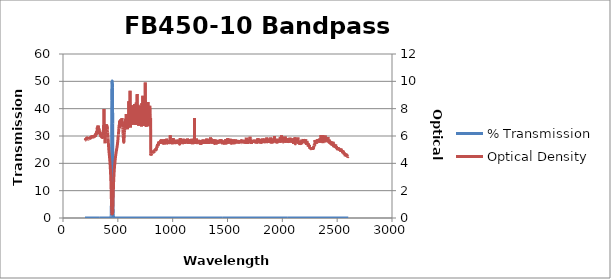
| Category | % Transmission |
|---|---|
| 2600.0 | 0.003 |
| 2599.0 | 0.003 |
| 2598.0 | 0.003 |
| 2597.0 | 0.003 |
| 2596.0 | 0.003 |
| 2595.0 | 0.003 |
| 2594.0 | 0.003 |
| 2593.0 | 0.003 |
| 2592.0 | 0.003 |
| 2591.0 | 0.003 |
| 2590.0 | 0.003 |
| 2589.0 | 0.003 |
| 2588.0 | 0.003 |
| 2587.0 | 0.003 |
| 2586.0 | 0.003 |
| 2585.0 | 0.003 |
| 2584.0 | 0.003 |
| 2583.0 | 0.002 |
| 2582.0 | 0.002 |
| 2581.0 | 0.002 |
| 2580.0 | 0.003 |
| 2579.0 | 0.002 |
| 2578.0 | 0.003 |
| 2577.0 | 0.002 |
| 2576.0 | 0.002 |
| 2575.0 | 0.002 |
| 2574.0 | 0.003 |
| 2573.0 | 0.002 |
| 2572.0 | 0.002 |
| 2571.0 | 0.002 |
| 2570.0 | 0.002 |
| 2569.0 | 0.002 |
| 2568.0 | 0.002 |
| 2567.0 | 0.002 |
| 2566.0 | 0.002 |
| 2565.0 | 0.002 |
| 2564.0 | 0.002 |
| 2563.0 | 0.002 |
| 2562.0 | 0.002 |
| 2561.0 | 0.002 |
| 2560.0 | 0.002 |
| 2559.0 | 0.002 |
| 2558.0 | 0.002 |
| 2557.0 | 0.002 |
| 2556.0 | 0.002 |
| 2555.0 | 0.001 |
| 2554.0 | 0.002 |
| 2553.0 | 0.002 |
| 2552.0 | 0.001 |
| 2551.0 | 0.002 |
| 2550.0 | 0.001 |
| 2549.0 | 0.001 |
| 2548.0 | 0.001 |
| 2547.0 | 0.001 |
| 2546.0 | 0.001 |
| 2545.0 | 0.001 |
| 2544.0 | 0.001 |
| 2543.0 | 0.001 |
| 2542.0 | 0.001 |
| 2541.0 | 0.001 |
| 2540.0 | 0.001 |
| 2539.0 | 0.001 |
| 2538.0 | 0.001 |
| 2537.0 | 0.001 |
| 2536.0 | 0.001 |
| 2535.0 | 0.001 |
| 2534.0 | 0.001 |
| 2533.0 | 0.001 |
| 2532.0 | 0.001 |
| 2531.0 | 0.001 |
| 2530.0 | 0.001 |
| 2529.0 | 0.001 |
| 2528.0 | 0.001 |
| 2527.0 | 0.001 |
| 2526.0 | 0.001 |
| 2525.0 | 0.001 |
| 2524.0 | 0.001 |
| 2523.0 | 0.001 |
| 2522.0 | 0.001 |
| 2521.0 | 0.001 |
| 2520.0 | 0.001 |
| 2519.0 | 0.001 |
| 2518.0 | 0.001 |
| 2517.0 | 0.001 |
| 2516.0 | 0.001 |
| 2515.0 | 0.001 |
| 2514.0 | 0.001 |
| 2513.0 | 0.001 |
| 2512.0 | 0.001 |
| 2511.0 | 0.001 |
| 2510.0 | 0.001 |
| 2509.0 | 0.001 |
| 2508.0 | 0.001 |
| 2507.0 | 0.001 |
| 2506.0 | 0.001 |
| 2505.0 | 0.001 |
| 2504.0 | 0.001 |
| 2503.0 | 0.001 |
| 2502.0 | 0.001 |
| 2501.0 | 0.001 |
| 2500.0 | 0.001 |
| 2499.0 | 0.001 |
| 2498.0 | 0.001 |
| 2497.0 | 0.001 |
| 2496.0 | 0.001 |
| 2495.0 | 0.001 |
| 2494.0 | 0.001 |
| 2493.0 | 0.001 |
| 2492.0 | 0.001 |
| 2491.0 | 0.001 |
| 2490.0 | 0.001 |
| 2489.0 | 0.001 |
| 2488.0 | 0.001 |
| 2487.0 | 0.001 |
| 2486.0 | 0 |
| 2485.0 | 0.001 |
| 2484.0 | 0.001 |
| 2483.0 | 0.001 |
| 2482.0 | 0.001 |
| 2481.0 | 0 |
| 2480.0 | 0 |
| 2479.0 | 0.001 |
| 2478.0 | 0.001 |
| 2477.0 | 0 |
| 2476.0 | 0 |
| 2475.0 | 0 |
| 2474.0 | 0.001 |
| 2473.0 | 0.001 |
| 2472.0 | 0 |
| 2471.0 | 0 |
| 2470.0 | 0.001 |
| 2469.0 | 0.001 |
| 2468.0 | 0 |
| 2467.0 | 0 |
| 2466.0 | 0.001 |
| 2465.0 | 0 |
| 2464.0 | 0 |
| 2463.0 | 0 |
| 2462.0 | 0 |
| 2461.0 | 0 |
| 2460.0 | 0 |
| 2459.0 | 0 |
| 2458.0 | 0 |
| 2457.0 | 0 |
| 2456.0 | 0 |
| 2455.0 | 0 |
| 2454.0 | 0.001 |
| 2453.0 | 0 |
| 2452.0 | 0 |
| 2451.0 | 0 |
| 2450.0 | 0 |
| 2449.0 | 0 |
| 2448.0 | 0 |
| 2447.0 | 0 |
| 2446.0 | 0 |
| 2445.0 | 0 |
| 2444.0 | 0 |
| 2443.0 | 0 |
| 2442.0 | 0 |
| 2441.0 | 0 |
| 2440.0 | 0 |
| 2439.0 | 0 |
| 2438.0 | 0 |
| 2437.0 | 0 |
| 2436.0 | 0 |
| 2435.0 | 0 |
| 2434.0 | 0 |
| 2433.0 | 0 |
| 2432.0 | 0 |
| 2431.0 | 0 |
| 2430.0 | 0 |
| 2429.0 | 0 |
| 2428.0 | 0 |
| 2427.0 | 0 |
| 2426.0 | 0 |
| 2425.0 | 0 |
| 2424.0 | 0 |
| 2423.0 | 0 |
| 2422.0 | 0 |
| 2421.0 | 0 |
| 2420.0 | 0 |
| 2419.0 | 0 |
| 2418.0 | 0 |
| 2417.0 | 0 |
| 2416.0 | 0 |
| 2415.0 | 0 |
| 2414.0 | 0 |
| 2413.0 | 0 |
| 2412.0 | 0 |
| 2411.0 | 0 |
| 2410.0 | 0 |
| 2409.0 | 0 |
| 2408.0 | 0 |
| 2407.0 | 0 |
| 2406.0 | 0 |
| 2405.0 | 0 |
| 2404.0 | 0 |
| 2403.0 | 0 |
| 2402.0 | 0 |
| 2401.0 | 0 |
| 2400.0 | 0 |
| 2399.0 | 0 |
| 2398.0 | 0 |
| 2397.0 | 0 |
| 2396.0 | 0 |
| 2395.0 | 0 |
| 2394.0 | 0 |
| 2393.0 | 0 |
| 2392.0 | 0 |
| 2391.0 | 0 |
| 2390.0 | 0 |
| 2389.0 | 0 |
| 2388.0 | 0 |
| 2387.0 | 0 |
| 2386.0 | 0 |
| 2385.0 | 0 |
| 2384.0 | 0 |
| 2383.0 | 0 |
| 2382.0 | 0 |
| 2381.0 | 0 |
| 2380.0 | 0 |
| 2379.0 | 0 |
| 2378.0 | 0 |
| 2377.0 | 0 |
| 2376.0 | 0 |
| 2375.0 | 0 |
| 2374.0 | 0 |
| 2373.0 | 0 |
| 2372.0 | 0 |
| 2371.0 | 0 |
| 2370.0 | 0 |
| 2369.0 | 0 |
| 2368.0 | 0 |
| 2367.0 | 0 |
| 2366.0 | 0 |
| 2365.0 | 0 |
| 2364.0 | 0 |
| 2363.0 | 0 |
| 2362.0 | 0 |
| 2361.0 | 0 |
| 2360.0 | 0 |
| 2359.0 | 0 |
| 2358.0 | 0 |
| 2357.0 | 0 |
| 2356.0 | 0 |
| 2355.0 | 0 |
| 2354.0 | 0 |
| 2353.0 | 0 |
| 2352.0 | 0 |
| 2351.0 | 0 |
| 2350.0 | 0 |
| 2349.0 | 0 |
| 2348.0 | 0 |
| 2347.0 | 0 |
| 2346.0 | 0 |
| 2345.0 | 0 |
| 2344.0 | 0 |
| 2343.0 | 0 |
| 2342.0 | 0 |
| 2341.0 | 0 |
| 2340.0 | 0 |
| 2339.0 | 0 |
| 2338.0 | 0 |
| 2337.0 | 0 |
| 2336.0 | 0 |
| 2335.0 | 0 |
| 2334.0 | 0 |
| 2333.0 | 0 |
| 2332.0 | 0 |
| 2331.0 | 0 |
| 2330.0 | 0 |
| 2329.0 | 0 |
| 2328.0 | 0 |
| 2327.0 | 0 |
| 2326.0 | 0 |
| 2325.0 | 0 |
| 2324.0 | 0 |
| 2323.0 | 0 |
| 2322.0 | 0 |
| 2321.0 | 0 |
| 2320.0 | 0 |
| 2319.0 | 0 |
| 2318.0 | 0 |
| 2317.0 | 0 |
| 2316.0 | 0 |
| 2315.0 | 0 |
| 2314.0 | 0 |
| 2313.0 | 0 |
| 2312.0 | 0 |
| 2311.0 | 0 |
| 2310.0 | 0 |
| 2309.0 | 0 |
| 2308.0 | 0 |
| 2307.0 | 0 |
| 2306.0 | 0 |
| 2305.0 | 0 |
| 2304.0 | 0 |
| 2303.0 | 0 |
| 2302.0 | 0 |
| 2301.0 | 0 |
| 2300.0 | 0 |
| 2299.0 | 0 |
| 2298.0 | 0 |
| 2297.0 | 0 |
| 2296.0 | 0 |
| 2295.0 | 0 |
| 2294.0 | 0 |
| 2293.0 | 0 |
| 2292.0 | 0 |
| 2291.0 | 0 |
| 2290.0 | 0 |
| 2289.0 | 0.001 |
| 2288.0 | 0.001 |
| 2287.0 | 0.001 |
| 2286.0 | 0.001 |
| 2285.0 | 0.001 |
| 2284.0 | 0.001 |
| 2283.0 | 0.001 |
| 2282.0 | 0.001 |
| 2281.0 | 0.001 |
| 2280.0 | 0.001 |
| 2279.0 | 0.001 |
| 2278.0 | 0.001 |
| 2277.0 | 0.001 |
| 2276.0 | 0.001 |
| 2275.0 | 0.001 |
| 2274.0 | 0.001 |
| 2273.0 | 0.001 |
| 2272.0 | 0.001 |
| 2271.0 | 0.001 |
| 2270.0 | 0.001 |
| 2269.0 | 0.001 |
| 2268.0 | 0.001 |
| 2267.0 | 0.001 |
| 2266.0 | 0.001 |
| 2265.0 | 0.001 |
| 2264.0 | 0.001 |
| 2263.0 | 0.001 |
| 2262.0 | 0.001 |
| 2261.0 | 0.001 |
| 2260.0 | 0.001 |
| 2259.0 | 0.001 |
| 2258.0 | 0.001 |
| 2257.0 | 0.001 |
| 2256.0 | 0.001 |
| 2255.0 | 0.001 |
| 2254.0 | 0.001 |
| 2253.0 | 0.001 |
| 2252.0 | 0.001 |
| 2251.0 | 0.001 |
| 2250.0 | 0.001 |
| 2249.0 | 0.001 |
| 2248.0 | 0.001 |
| 2247.0 | 0.001 |
| 2246.0 | 0 |
| 2245.0 | 0.001 |
| 2244.0 | 0.001 |
| 2243.0 | 0 |
| 2242.0 | 0.001 |
| 2241.0 | 0 |
| 2240.0 | 0.001 |
| 2239.0 | 0 |
| 2238.0 | 0.001 |
| 2237.0 | 0 |
| 2236.0 | 0 |
| 2235.0 | 0 |
| 2234.0 | 0 |
| 2233.0 | 0 |
| 2232.0 | 0 |
| 2231.0 | 0 |
| 2230.0 | 0 |
| 2229.0 | 0 |
| 2228.0 | 0 |
| 2227.0 | 0 |
| 2226.0 | 0 |
| 2225.0 | 0 |
| 2224.0 | 0 |
| 2223.0 | 0 |
| 2222.0 | 0 |
| 2221.0 | 0 |
| 2220.0 | 0 |
| 2219.0 | 0 |
| 2218.0 | 0 |
| 2217.0 | 0 |
| 2216.0 | 0 |
| 2215.0 | 0 |
| 2214.0 | 0 |
| 2213.0 | 0 |
| 2212.0 | 0 |
| 2211.0 | 0 |
| 2210.0 | 0 |
| 2209.0 | 0 |
| 2208.0 | 0 |
| 2207.0 | 0 |
| 2206.0 | 0 |
| 2205.0 | 0 |
| 2204.0 | 0 |
| 2203.0 | 0 |
| 2202.0 | 0 |
| 2201.0 | 0 |
| 2200.0 | 0 |
| 2199.0 | 0 |
| 2198.0 | 0 |
| 2197.0 | 0 |
| 2196.0 | 0 |
| 2195.0 | 0 |
| 2194.0 | 0 |
| 2193.0 | 0 |
| 2192.0 | 0 |
| 2191.0 | 0 |
| 2190.0 | 0 |
| 2189.0 | 0 |
| 2188.0 | 0 |
| 2187.0 | 0 |
| 2186.0 | 0 |
| 2185.0 | 0 |
| 2184.0 | 0 |
| 2183.0 | 0 |
| 2182.0 | 0 |
| 2181.0 | 0 |
| 2180.0 | 0 |
| 2179.0 | 0 |
| 2178.0 | 0 |
| 2177.0 | 0 |
| 2176.0 | 0 |
| 2175.0 | 0 |
| 2174.0 | 0 |
| 2173.0 | 0 |
| 2172.0 | 0 |
| 2171.0 | 0 |
| 2170.0 | 0 |
| 2169.0 | 0 |
| 2168.0 | 0 |
| 2167.0 | 0 |
| 2166.0 | 0 |
| 2165.0 | 0 |
| 2164.0 | 0 |
| 2163.0 | 0 |
| 2162.0 | 0 |
| 2161.0 | 0 |
| 2160.0 | 0 |
| 2159.0 | 0 |
| 2158.0 | 0 |
| 2157.0 | 0 |
| 2156.0 | 0 |
| 2155.0 | 0 |
| 2154.0 | 0 |
| 2153.0 | 0 |
| 2152.0 | 0 |
| 2151.0 | 0 |
| 2150.0 | 0 |
| 2149.0 | 0 |
| 2148.0 | 0 |
| 2147.0 | 0 |
| 2146.0 | 0 |
| 2145.0 | 0 |
| 2144.0 | 0 |
| 2143.0 | 0 |
| 2142.0 | 0 |
| 2141.0 | 0 |
| 2140.0 | 0 |
| 2139.0 | 0 |
| 2138.0 | 0 |
| 2137.0 | 0 |
| 2136.0 | 0 |
| 2135.0 | 0 |
| 2134.0 | 0 |
| 2133.0 | 0 |
| 2132.0 | 0 |
| 2131.0 | 0 |
| 2130.0 | 0 |
| 2129.0 | 0 |
| 2128.0 | 0 |
| 2127.0 | 0 |
| 2126.0 | 0 |
| 2125.0 | 0 |
| 2124.0 | 0 |
| 2123.0 | 0 |
| 2122.0 | 0 |
| 2121.0 | 0 |
| 2120.0 | 0 |
| 2119.0 | 0 |
| 2118.0 | 0 |
| 2117.0 | 0 |
| 2116.0 | 0 |
| 2115.0 | 0 |
| 2114.0 | 0 |
| 2113.0 | 0 |
| 2112.0 | 0 |
| 2111.0 | 0 |
| 2110.0 | 0 |
| 2109.0 | 0 |
| 2108.0 | 0 |
| 2107.0 | 0 |
| 2106.0 | 0 |
| 2105.0 | 0 |
| 2104.0 | 0 |
| 2103.0 | 0 |
| 2102.0 | 0 |
| 2101.0 | 0 |
| 2100.0 | 0 |
| 2099.0 | 0 |
| 2098.0 | 0 |
| 2097.0 | 0 |
| 2096.0 | 0 |
| 2095.0 | 0 |
| 2094.0 | 0 |
| 2093.0 | 0 |
| 2092.0 | 0 |
| 2091.0 | 0 |
| 2090.0 | 0 |
| 2089.0 | 0 |
| 2088.0 | 0 |
| 2087.0 | 0 |
| 2086.0 | 0 |
| 2085.0 | 0 |
| 2084.0 | 0 |
| 2083.0 | 0 |
| 2082.0 | 0 |
| 2081.0 | 0 |
| 2080.0 | 0 |
| 2079.0 | 0 |
| 2078.0 | 0 |
| 2077.0 | 0 |
| 2076.0 | 0 |
| 2075.0 | 0 |
| 2074.0 | 0 |
| 2073.0 | 0 |
| 2072.0 | 0 |
| 2071.0 | 0 |
| 2070.0 | 0 |
| 2069.0 | 0 |
| 2068.0 | 0 |
| 2067.0 | 0 |
| 2066.0 | 0 |
| 2065.0 | 0 |
| 2064.0 | 0 |
| 2063.0 | 0 |
| 2062.0 | 0 |
| 2061.0 | 0 |
| 2060.0 | 0 |
| 2059.0 | 0 |
| 2058.0 | 0 |
| 2057.0 | 0 |
| 2056.0 | 0 |
| 2055.0 | 0 |
| 2054.0 | 0 |
| 2053.0 | 0 |
| 2052.0 | 0 |
| 2051.0 | 0 |
| 2050.0 | 0 |
| 2049.0 | 0 |
| 2048.0 | 0 |
| 2047.0 | 0 |
| 2046.0 | 0 |
| 2045.0 | 0 |
| 2044.0 | 0 |
| 2043.0 | 0 |
| 2042.0 | 0 |
| 2041.0 | 0 |
| 2040.0 | 0 |
| 2039.0 | 0 |
| 2038.0 | 0 |
| 2037.0 | 0 |
| 2036.0 | 0 |
| 2035.0 | 0 |
| 2034.0 | 0 |
| 2033.0 | 0 |
| 2032.0 | 0 |
| 2031.0 | 0 |
| 2030.0 | 0 |
| 2029.0 | 0 |
| 2028.0 | 0 |
| 2027.0 | 0 |
| 2026.0 | 0 |
| 2025.0 | 0 |
| 2024.0 | 0 |
| 2023.0 | 0 |
| 2022.0 | 0 |
| 2021.0 | 0 |
| 2020.0 | 0 |
| 2019.0 | 0 |
| 2018.0 | 0 |
| 2017.0 | 0 |
| 2016.0 | 0 |
| 2015.0 | 0 |
| 2014.0 | 0 |
| 2013.0 | 0 |
| 2012.0 | 0 |
| 2011.0 | 0 |
| 2010.0 | 0 |
| 2009.0 | 0 |
| 2008.0 | 0 |
| 2007.0 | 0 |
| 2006.0 | 0 |
| 2005.0 | 0 |
| 2004.0 | 0 |
| 2003.0 | 0 |
| 2002.0 | 0 |
| 2001.0 | 0 |
| 2000.0 | 0 |
| 1999.0 | 0 |
| 1998.0 | 0 |
| 1997.0 | 0 |
| 1996.0 | 0 |
| 1995.0 | 0 |
| 1994.0 | 0 |
| 1993.0 | 0 |
| 1992.0 | 0 |
| 1991.0 | 0 |
| 1990.0 | 0 |
| 1989.0 | 0 |
| 1988.0 | 0 |
| 1987.0 | 0 |
| 1986.0 | 0 |
| 1985.0 | 0 |
| 1984.0 | 0 |
| 1983.0 | 0 |
| 1982.0 | 0 |
| 1981.0 | 0 |
| 1980.0 | 0 |
| 1979.0 | 0 |
| 1978.0 | 0 |
| 1977.0 | 0 |
| 1976.0 | 0 |
| 1975.0 | 0 |
| 1974.0 | 0 |
| 1973.0 | 0 |
| 1972.0 | 0 |
| 1971.0 | 0 |
| 1970.0 | 0 |
| 1969.0 | 0 |
| 1968.0 | 0 |
| 1967.0 | 0 |
| 1966.0 | 0 |
| 1965.0 | 0 |
| 1964.0 | 0 |
| 1963.0 | 0 |
| 1962.0 | 0 |
| 1961.0 | 0 |
| 1960.0 | 0 |
| 1959.0 | 0 |
| 1958.0 | 0 |
| 1957.0 | 0 |
| 1956.0 | 0 |
| 1955.0 | 0 |
| 1954.0 | 0 |
| 1953.0 | 0 |
| 1952.0 | 0 |
| 1951.0 | 0 |
| 1950.0 | 0 |
| 1949.0 | 0 |
| 1948.0 | 0 |
| 1947.0 | 0 |
| 1946.0 | 0 |
| 1945.0 | 0 |
| 1944.0 | 0 |
| 1943.0 | 0 |
| 1942.0 | 0 |
| 1941.0 | 0 |
| 1940.0 | 0 |
| 1939.0 | 0 |
| 1938.0 | 0 |
| 1937.0 | 0 |
| 1936.0 | 0 |
| 1935.0 | 0 |
| 1934.0 | 0 |
| 1933.0 | 0 |
| 1932.0 | 0 |
| 1931.0 | 0 |
| 1930.0 | 0 |
| 1929.0 | 0 |
| 1928.0 | 0 |
| 1927.0 | 0 |
| 1926.0 | 0 |
| 1925.0 | 0 |
| 1924.0 | 0 |
| 1923.0 | 0 |
| 1922.0 | 0 |
| 1921.0 | 0 |
| 1920.0 | 0 |
| 1919.0 | 0 |
| 1918.0 | 0 |
| 1917.0 | 0 |
| 1916.0 | 0 |
| 1915.0 | 0 |
| 1914.0 | 0 |
| 1913.0 | 0 |
| 1912.0 | 0 |
| 1911.0 | 0 |
| 1910.0 | 0 |
| 1909.0 | 0 |
| 1908.0 | 0 |
| 1907.0 | 0 |
| 1906.0 | 0 |
| 1905.0 | 0 |
| 1904.0 | 0 |
| 1903.0 | 0 |
| 1902.0 | 0 |
| 1901.0 | 0 |
| 1900.0 | 0 |
| 1899.0 | 0 |
| 1898.0 | 0 |
| 1897.0 | 0 |
| 1896.0 | 0 |
| 1895.0 | 0 |
| 1894.0 | 0 |
| 1893.0 | 0 |
| 1892.0 | 0 |
| 1891.0 | 0 |
| 1890.0 | 0 |
| 1889.0 | 0 |
| 1888.0 | 0 |
| 1887.0 | 0 |
| 1886.0 | 0 |
| 1885.0 | 0 |
| 1884.0 | 0 |
| 1883.0 | 0 |
| 1882.0 | 0 |
| 1881.0 | 0 |
| 1880.0 | 0 |
| 1879.0 | 0 |
| 1878.0 | 0 |
| 1877.0 | 0 |
| 1876.0 | 0 |
| 1875.0 | 0 |
| 1874.0 | 0 |
| 1873.0 | 0 |
| 1872.0 | 0 |
| 1871.0 | 0 |
| 1870.0 | 0 |
| 1869.0 | 0 |
| 1868.0 | 0 |
| 1867.0 | 0 |
| 1866.0 | 0 |
| 1865.0 | 0 |
| 1864.0 | 0 |
| 1863.0 | 0 |
| 1862.0 | 0 |
| 1861.0 | 0 |
| 1860.0 | 0 |
| 1859.0 | 0 |
| 1858.0 | 0 |
| 1857.0 | 0 |
| 1856.0 | 0 |
| 1855.0 | 0 |
| 1854.0 | 0 |
| 1853.0 | 0 |
| 1852.0 | 0 |
| 1851.0 | 0 |
| 1850.0 | 0 |
| 1849.0 | 0 |
| 1848.0 | 0 |
| 1847.0 | 0 |
| 1846.0 | 0 |
| 1845.0 | 0 |
| 1844.0 | 0 |
| 1843.0 | 0 |
| 1842.0 | 0 |
| 1841.0 | 0 |
| 1840.0 | 0 |
| 1839.0 | 0 |
| 1838.0 | 0 |
| 1837.0 | 0 |
| 1836.0 | 0 |
| 1835.0 | 0 |
| 1834.0 | 0 |
| 1833.0 | 0 |
| 1832.0 | 0 |
| 1831.0 | 0 |
| 1830.0 | 0 |
| 1829.0 | 0 |
| 1828.0 | 0 |
| 1827.0 | 0 |
| 1826.0 | 0 |
| 1825.0 | 0 |
| 1824.0 | 0 |
| 1823.0 | 0 |
| 1822.0 | 0 |
| 1821.0 | 0 |
| 1820.0 | 0 |
| 1819.0 | 0 |
| 1818.0 | 0 |
| 1817.0 | 0 |
| 1816.0 | 0 |
| 1815.0 | 0 |
| 1814.0 | 0 |
| 1813.0 | 0 |
| 1812.0 | 0 |
| 1811.0 | 0 |
| 1810.0 | 0 |
| 1809.0 | 0 |
| 1808.0 | 0 |
| 1807.0 | 0 |
| 1806.0 | 0 |
| 1805.0 | 0 |
| 1804.0 | 0 |
| 1803.0 | 0 |
| 1802.0 | 0 |
| 1801.0 | 0 |
| 1800.0 | 0 |
| 1799.0 | 0 |
| 1798.0 | 0 |
| 1797.0 | 0 |
| 1796.0 | 0 |
| 1795.0 | 0 |
| 1794.0 | 0 |
| 1793.0 | 0 |
| 1792.0 | 0 |
| 1791.0 | 0 |
| 1790.0 | 0 |
| 1789.0 | 0 |
| 1788.0 | 0 |
| 1787.0 | 0 |
| 1786.0 | 0 |
| 1785.0 | 0 |
| 1784.0 | 0 |
| 1783.0 | 0 |
| 1782.0 | 0 |
| 1781.0 | 0 |
| 1780.0 | 0 |
| 1779.0 | 0 |
| 1778.0 | 0 |
| 1777.0 | 0 |
| 1776.0 | 0 |
| 1775.0 | 0 |
| 1774.0 | 0 |
| 1773.0 | 0 |
| 1772.0 | 0 |
| 1771.0 | 0 |
| 1770.0 | 0 |
| 1769.0 | 0 |
| 1768.0 | 0 |
| 1767.0 | 0 |
| 1766.0 | 0 |
| 1765.0 | 0 |
| 1764.0 | 0 |
| 1763.0 | 0 |
| 1762.0 | 0 |
| 1761.0 | 0 |
| 1760.0 | 0 |
| 1759.0 | 0 |
| 1758.0 | 0 |
| 1757.0 | 0 |
| 1756.0 | 0 |
| 1755.0 | 0 |
| 1754.0 | 0 |
| 1753.0 | 0 |
| 1752.0 | 0 |
| 1751.0 | 0 |
| 1750.0 | 0 |
| 1749.0 | 0 |
| 1748.0 | 0 |
| 1747.0 | 0 |
| 1746.0 | 0 |
| 1745.0 | 0 |
| 1744.0 | 0 |
| 1743.0 | 0 |
| 1742.0 | 0 |
| 1741.0 | 0 |
| 1740.0 | 0 |
| 1739.0 | 0 |
| 1738.0 | 0 |
| 1737.0 | 0 |
| 1736.0 | 0 |
| 1735.0 | 0 |
| 1734.0 | 0 |
| 1733.0 | 0 |
| 1732.0 | 0 |
| 1731.0 | 0 |
| 1730.0 | 0 |
| 1729.0 | 0 |
| 1728.0 | 0 |
| 1727.0 | 0 |
| 1726.0 | 0 |
| 1725.0 | 0 |
| 1724.0 | 0 |
| 1723.0 | 0 |
| 1722.0 | 0 |
| 1721.0 | 0 |
| 1720.0 | 0 |
| 1719.0 | 0 |
| 1718.0 | 0 |
| 1717.0 | 0 |
| 1716.0 | 0 |
| 1715.0 | 0 |
| 1714.0 | 0 |
| 1713.0 | 0 |
| 1712.0 | 0 |
| 1711.0 | 0 |
| 1710.0 | 0 |
| 1709.0 | 0 |
| 1708.0 | 0 |
| 1707.0 | 0 |
| 1706.0 | 0 |
| 1705.0 | 0 |
| 1704.0 | 0 |
| 1703.0 | 0 |
| 1702.0 | 0 |
| 1701.0 | 0 |
| 1700.0 | 0 |
| 1699.0 | 0 |
| 1698.0 | 0 |
| 1697.0 | 0 |
| 1696.0 | 0 |
| 1695.0 | 0 |
| 1694.0 | 0 |
| 1693.0 | 0 |
| 1692.0 | 0 |
| 1691.0 | 0 |
| 1690.0 | 0 |
| 1689.0 | 0 |
| 1688.0 | 0 |
| 1687.0 | 0 |
| 1686.0 | 0 |
| 1685.0 | 0 |
| 1684.0 | 0 |
| 1683.0 | 0 |
| 1682.0 | 0 |
| 1681.0 | 0 |
| 1680.0 | 0 |
| 1679.0 | 0 |
| 1678.0 | 0 |
| 1677.0 | 0 |
| 1676.0 | 0 |
| 1675.0 | 0 |
| 1674.0 | 0 |
| 1673.0 | 0 |
| 1672.0 | 0 |
| 1671.0 | 0 |
| 1670.0 | 0 |
| 1669.0 | 0 |
| 1668.0 | 0 |
| 1667.0 | 0 |
| 1666.0 | 0 |
| 1665.0 | 0 |
| 1664.0 | 0 |
| 1663.0 | 0 |
| 1662.0 | 0 |
| 1661.0 | 0 |
| 1660.0 | 0 |
| 1659.0 | 0 |
| 1658.0 | 0 |
| 1657.0 | 0 |
| 1656.0 | 0 |
| 1655.0 | 0 |
| 1654.0 | 0 |
| 1653.0 | 0 |
| 1652.0 | 0 |
| 1651.0 | 0 |
| 1650.0 | 0 |
| 1649.0 | 0 |
| 1648.0 | 0 |
| 1647.0 | 0 |
| 1646.0 | 0 |
| 1645.0 | 0 |
| 1644.0 | 0 |
| 1643.0 | 0 |
| 1642.0 | 0 |
| 1641.0 | 0 |
| 1640.0 | 0 |
| 1639.0 | 0 |
| 1638.0 | 0 |
| 1637.0 | 0 |
| 1636.0 | 0 |
| 1635.0 | 0 |
| 1634.0 | 0 |
| 1633.0 | 0 |
| 1632.0 | 0 |
| 1631.0 | 0 |
| 1630.0 | 0 |
| 1629.0 | 0 |
| 1628.0 | 0 |
| 1627.0 | 0 |
| 1626.0 | 0 |
| 1625.0 | 0 |
| 1624.0 | 0 |
| 1623.0 | 0 |
| 1622.0 | 0 |
| 1621.0 | 0 |
| 1620.0 | 0 |
| 1619.0 | 0 |
| 1618.0 | 0 |
| 1617.0 | 0 |
| 1616.0 | 0 |
| 1615.0 | 0 |
| 1614.0 | 0 |
| 1613.0 | 0 |
| 1612.0 | 0 |
| 1611.0 | 0 |
| 1610.0 | 0 |
| 1609.0 | 0 |
| 1608.0 | 0 |
| 1607.0 | 0 |
| 1606.0 | 0 |
| 1605.0 | 0 |
| 1604.0 | 0 |
| 1603.0 | 0 |
| 1602.0 | 0 |
| 1601.0 | 0 |
| 1600.0 | 0 |
| 1599.0 | 0 |
| 1598.0 | 0 |
| 1597.0 | 0 |
| 1596.0 | 0 |
| 1595.0 | 0 |
| 1594.0 | 0 |
| 1593.0 | 0 |
| 1592.0 | 0 |
| 1591.0 | 0 |
| 1590.0 | 0 |
| 1589.0 | 0 |
| 1588.0 | 0 |
| 1587.0 | 0 |
| 1586.0 | 0 |
| 1585.0 | 0 |
| 1584.0 | 0 |
| 1583.0 | 0 |
| 1582.0 | 0 |
| 1581.0 | 0 |
| 1580.0 | 0 |
| 1579.0 | 0 |
| 1578.0 | 0 |
| 1577.0 | 0 |
| 1576.0 | 0 |
| 1575.0 | 0 |
| 1574.0 | 0 |
| 1573.0 | 0 |
| 1572.0 | 0 |
| 1571.0 | 0 |
| 1570.0 | 0 |
| 1569.0 | 0 |
| 1568.0 | 0 |
| 1567.0 | 0 |
| 1566.0 | 0 |
| 1565.0 | 0 |
| 1564.0 | 0 |
| 1563.0 | 0 |
| 1562.0 | 0 |
| 1561.0 | 0 |
| 1560.0 | 0 |
| 1559.0 | 0 |
| 1558.0 | 0 |
| 1557.0 | 0 |
| 1556.0 | 0 |
| 1555.0 | 0 |
| 1554.0 | 0 |
| 1553.0 | 0 |
| 1552.0 | 0 |
| 1551.0 | 0 |
| 1550.0 | 0 |
| 1549.0 | 0 |
| 1548.0 | 0 |
| 1547.0 | 0 |
| 1546.0 | 0 |
| 1545.0 | 0 |
| 1544.0 | 0 |
| 1543.0 | 0 |
| 1542.0 | 0 |
| 1541.0 | 0 |
| 1540.0 | 0 |
| 1539.0 | 0 |
| 1538.0 | 0 |
| 1537.0 | 0 |
| 1536.0 | 0 |
| 1535.0 | 0 |
| 1534.0 | 0 |
| 1533.0 | 0 |
| 1532.0 | 0 |
| 1531.0 | 0 |
| 1530.0 | 0 |
| 1529.0 | 0 |
| 1528.0 | 0 |
| 1527.0 | 0 |
| 1526.0 | 0 |
| 1525.0 | 0 |
| 1524.0 | 0 |
| 1523.0 | 0 |
| 1522.0 | 0 |
| 1521.0 | 0 |
| 1520.0 | 0 |
| 1519.0 | 0 |
| 1518.0 | 0 |
| 1517.0 | 0 |
| 1516.0 | 0 |
| 1515.0 | 0 |
| 1514.0 | 0 |
| 1513.0 | 0 |
| 1512.0 | 0 |
| 1511.0 | 0 |
| 1510.0 | 0 |
| 1509.0 | 0 |
| 1508.0 | 0 |
| 1507.0 | 0 |
| 1506.0 | 0 |
| 1505.0 | 0 |
| 1504.0 | 0 |
| 1503.0 | 0 |
| 1502.0 | 0 |
| 1501.0 | 0 |
| 1500.0 | 0 |
| 1499.0 | 0 |
| 1498.0 | 0 |
| 1497.0 | 0 |
| 1496.0 | 0 |
| 1495.0 | 0 |
| 1494.0 | 0 |
| 1493.0 | 0 |
| 1492.0 | 0 |
| 1491.0 | 0 |
| 1490.0 | 0 |
| 1489.0 | 0 |
| 1488.0 | 0 |
| 1487.0 | 0 |
| 1486.0 | 0 |
| 1485.0 | 0 |
| 1484.0 | 0 |
| 1483.0 | 0 |
| 1482.0 | 0 |
| 1481.0 | 0 |
| 1480.0 | 0 |
| 1479.0 | 0 |
| 1478.0 | 0 |
| 1477.0 | 0 |
| 1476.0 | 0 |
| 1475.0 | 0 |
| 1474.0 | 0 |
| 1473.0 | 0 |
| 1472.0 | 0 |
| 1471.0 | 0 |
| 1470.0 | 0 |
| 1469.0 | 0 |
| 1468.0 | 0 |
| 1467.0 | 0 |
| 1466.0 | 0 |
| 1465.0 | 0 |
| 1464.0 | 0 |
| 1463.0 | 0 |
| 1462.0 | 0 |
| 1461.0 | 0 |
| 1460.0 | 0 |
| 1459.0 | 0 |
| 1458.0 | 0 |
| 1457.0 | 0 |
| 1456.0 | 0 |
| 1455.0 | 0 |
| 1454.0 | 0 |
| 1453.0 | 0 |
| 1452.0 | 0 |
| 1451.0 | 0 |
| 1450.0 | 0 |
| 1449.0 | 0 |
| 1448.0 | 0 |
| 1447.0 | 0 |
| 1446.0 | 0 |
| 1445.0 | 0 |
| 1444.0 | 0 |
| 1443.0 | 0 |
| 1442.0 | 0 |
| 1441.0 | 0 |
| 1440.0 | 0 |
| 1439.0 | 0 |
| 1438.0 | 0 |
| 1437.0 | 0 |
| 1436.0 | 0 |
| 1435.0 | 0 |
| 1434.0 | 0 |
| 1433.0 | 0 |
| 1432.0 | 0 |
| 1431.0 | 0 |
| 1430.0 | 0 |
| 1429.0 | 0 |
| 1428.0 | 0 |
| 1427.0 | 0 |
| 1426.0 | 0 |
| 1425.0 | 0 |
| 1424.0 | 0 |
| 1423.0 | 0 |
| 1422.0 | 0 |
| 1421.0 | 0 |
| 1420.0 | 0 |
| 1419.0 | 0 |
| 1418.0 | 0 |
| 1417.0 | 0 |
| 1416.0 | 0 |
| 1415.0 | 0 |
| 1414.0 | 0 |
| 1413.0 | 0 |
| 1412.0 | 0 |
| 1411.0 | 0 |
| 1410.0 | 0 |
| 1409.0 | 0 |
| 1408.0 | 0 |
| 1407.0 | 0 |
| 1406.0 | 0 |
| 1405.0 | 0 |
| 1404.0 | 0 |
| 1403.0 | 0 |
| 1402.0 | 0 |
| 1401.0 | 0 |
| 1400.0 | 0 |
| 1399.0 | 0 |
| 1398.0 | 0 |
| 1397.0 | 0 |
| 1396.0 | 0 |
| 1395.0 | 0 |
| 1394.0 | 0 |
| 1393.0 | 0 |
| 1392.0 | 0 |
| 1391.0 | 0 |
| 1390.0 | 0 |
| 1389.0 | 0 |
| 1388.0 | 0 |
| 1387.0 | 0 |
| 1386.0 | 0 |
| 1385.0 | 0 |
| 1384.0 | 0 |
| 1383.0 | 0 |
| 1382.0 | 0 |
| 1381.0 | 0 |
| 1380.0 | 0 |
| 1379.0 | 0 |
| 1378.0 | 0 |
| 1377.0 | 0 |
| 1376.0 | 0 |
| 1375.0 | 0 |
| 1374.0 | 0 |
| 1373.0 | 0 |
| 1372.0 | 0 |
| 1371.0 | 0 |
| 1370.0 | 0 |
| 1369.0 | 0 |
| 1368.0 | 0 |
| 1367.0 | 0 |
| 1366.0 | 0 |
| 1365.0 | 0 |
| 1364.0 | 0 |
| 1363.0 | 0 |
| 1362.0 | 0 |
| 1361.0 | 0 |
| 1360.0 | 0 |
| 1359.0 | 0 |
| 1358.0 | 0 |
| 1357.0 | 0 |
| 1356.0 | 0 |
| 1355.0 | 0 |
| 1354.0 | 0 |
| 1353.0 | 0 |
| 1352.0 | 0 |
| 1351.0 | 0 |
| 1350.0 | 0 |
| 1349.0 | 0 |
| 1348.0 | 0 |
| 1347.0 | 0 |
| 1346.0 | 0 |
| 1345.0 | 0 |
| 1344.0 | 0 |
| 1343.0 | 0 |
| 1342.0 | 0 |
| 1341.0 | 0 |
| 1340.0 | 0 |
| 1339.0 | 0 |
| 1338.0 | 0 |
| 1337.0 | 0 |
| 1336.0 | 0 |
| 1335.0 | 0 |
| 1334.0 | 0 |
| 1333.0 | 0 |
| 1332.0 | 0 |
| 1331.0 | 0 |
| 1330.0 | 0 |
| 1329.0 | 0 |
| 1328.0 | 0 |
| 1327.0 | 0 |
| 1326.0 | 0 |
| 1325.0 | 0 |
| 1324.0 | 0 |
| 1323.0 | 0 |
| 1322.0 | 0 |
| 1321.0 | 0 |
| 1320.0 | 0 |
| 1319.0 | 0 |
| 1318.0 | 0 |
| 1317.0 | 0 |
| 1316.0 | 0 |
| 1315.0 | 0 |
| 1314.0 | 0 |
| 1313.0 | 0 |
| 1312.0 | 0 |
| 1311.0 | 0 |
| 1310.0 | 0 |
| 1309.0 | 0 |
| 1308.0 | 0 |
| 1307.0 | 0 |
| 1306.0 | 0 |
| 1305.0 | 0 |
| 1304.0 | 0 |
| 1303.0 | 0 |
| 1302.0 | 0 |
| 1301.0 | 0 |
| 1300.0 | 0 |
| 1299.0 | 0 |
| 1298.0 | 0 |
| 1297.0 | 0 |
| 1296.0 | 0 |
| 1295.0 | 0 |
| 1294.0 | 0 |
| 1293.0 | 0 |
| 1292.0 | 0 |
| 1291.0 | 0 |
| 1290.0 | 0 |
| 1289.0 | 0 |
| 1288.0 | 0 |
| 1287.0 | 0 |
| 1286.0 | 0 |
| 1285.0 | 0 |
| 1284.0 | 0 |
| 1283.0 | 0 |
| 1282.0 | 0 |
| 1281.0 | 0 |
| 1280.0 | 0 |
| 1279.0 | 0 |
| 1278.0 | 0 |
| 1277.0 | 0 |
| 1276.0 | 0 |
| 1275.0 | 0 |
| 1274.0 | 0 |
| 1273.0 | 0 |
| 1272.0 | 0 |
| 1271.0 | 0 |
| 1270.0 | 0 |
| 1269.0 | 0 |
| 1268.0 | 0 |
| 1267.0 | 0 |
| 1266.0 | 0 |
| 1265.0 | 0 |
| 1264.0 | 0 |
| 1263.0 | 0 |
| 1262.0 | 0 |
| 1261.0 | 0 |
| 1260.0 | 0 |
| 1259.0 | 0 |
| 1258.0 | 0 |
| 1257.0 | 0 |
| 1256.0 | 0 |
| 1255.0 | 0 |
| 1254.0 | 0 |
| 1253.0 | 0 |
| 1252.0 | 0 |
| 1251.0 | 0 |
| 1250.0 | 0 |
| 1249.0 | 0 |
| 1248.0 | 0 |
| 1247.0 | 0 |
| 1246.0 | 0 |
| 1245.0 | 0 |
| 1244.0 | 0 |
| 1243.0 | 0 |
| 1242.0 | 0 |
| 1241.0 | 0 |
| 1240.0 | 0 |
| 1239.0 | 0 |
| 1238.0 | 0 |
| 1237.0 | 0 |
| 1236.0 | 0 |
| 1235.0 | 0 |
| 1234.0 | 0 |
| 1233.0 | 0 |
| 1232.0 | 0 |
| 1231.0 | 0 |
| 1230.0 | 0 |
| 1229.0 | 0 |
| 1228.0 | 0 |
| 1227.0 | 0 |
| 1226.0 | 0 |
| 1225.0 | 0 |
| 1224.0 | 0 |
| 1223.0 | 0 |
| 1222.0 | 0 |
| 1221.0 | 0 |
| 1220.0 | 0 |
| 1219.0 | 0 |
| 1218.0 | 0 |
| 1217.0 | 0 |
| 1216.0 | 0 |
| 1215.0 | 0 |
| 1214.0 | 0 |
| 1213.0 | 0 |
| 1212.0 | 0 |
| 1211.0 | 0 |
| 1210.0 | 0 |
| 1209.0 | 0 |
| 1208.0 | 0 |
| 1207.0 | 0 |
| 1206.0 | 0 |
| 1205.0 | 0 |
| 1204.0 | 0 |
| 1203.0 | 0 |
| 1202.0 | 0 |
| 1201.0 | 0 |
| 1200.0 | 0 |
| 1199.0 | 0 |
| 1198.0 | 0 |
| 1197.0 | 0 |
| 1196.0 | 0 |
| 1195.0 | 0 |
| 1194.0 | 0 |
| 1193.0 | 0 |
| 1192.0 | 0 |
| 1191.0 | 0 |
| 1190.0 | 0 |
| 1189.0 | 0 |
| 1188.0 | 0 |
| 1187.0 | 0 |
| 1186.0 | 0 |
| 1185.0 | 0 |
| 1184.0 | 0 |
| 1183.0 | 0 |
| 1182.0 | 0 |
| 1181.0 | 0 |
| 1180.0 | 0 |
| 1179.0 | 0 |
| 1178.0 | 0 |
| 1177.0 | 0 |
| 1176.0 | 0 |
| 1175.0 | 0 |
| 1174.0 | 0 |
| 1173.0 | 0 |
| 1172.0 | 0 |
| 1171.0 | 0 |
| 1170.0 | 0 |
| 1169.0 | 0 |
| 1168.0 | 0 |
| 1167.0 | 0 |
| 1166.0 | 0 |
| 1165.0 | 0 |
| 1164.0 | 0 |
| 1163.0 | 0 |
| 1162.0 | 0 |
| 1161.0 | 0 |
| 1160.0 | 0 |
| 1159.0 | 0 |
| 1158.0 | 0 |
| 1157.0 | 0 |
| 1156.0 | 0 |
| 1155.0 | 0 |
| 1154.0 | 0 |
| 1153.0 | 0 |
| 1152.0 | 0 |
| 1151.0 | 0 |
| 1150.0 | 0 |
| 1149.0 | 0 |
| 1148.0 | 0 |
| 1147.0 | 0 |
| 1146.0 | 0 |
| 1145.0 | 0 |
| 1144.0 | 0 |
| 1143.0 | 0 |
| 1142.0 | 0 |
| 1141.0 | 0 |
| 1140.0 | 0 |
| 1139.0 | 0 |
| 1138.0 | 0 |
| 1137.0 | 0 |
| 1136.0 | 0 |
| 1135.0 | 0 |
| 1134.0 | 0 |
| 1133.0 | 0 |
| 1132.0 | 0 |
| 1131.0 | 0 |
| 1130.0 | 0 |
| 1129.0 | 0 |
| 1128.0 | 0 |
| 1127.0 | 0 |
| 1126.0 | 0 |
| 1125.0 | 0 |
| 1124.0 | 0 |
| 1123.0 | 0 |
| 1122.0 | 0 |
| 1121.0 | 0 |
| 1120.0 | 0 |
| 1119.0 | 0 |
| 1118.0 | 0 |
| 1117.0 | 0 |
| 1116.0 | 0 |
| 1115.0 | 0 |
| 1114.0 | 0 |
| 1113.0 | 0 |
| 1112.0 | 0 |
| 1111.0 | 0 |
| 1110.0 | 0 |
| 1109.0 | 0 |
| 1108.0 | 0 |
| 1107.0 | 0 |
| 1106.0 | 0 |
| 1105.0 | 0 |
| 1104.0 | 0 |
| 1103.0 | 0 |
| 1102.0 | 0 |
| 1101.0 | 0 |
| 1100.0 | 0 |
| 1099.0 | 0 |
| 1098.0 | 0 |
| 1097.0 | 0 |
| 1096.0 | 0 |
| 1095.0 | 0 |
| 1094.0 | 0 |
| 1093.0 | 0 |
| 1092.0 | 0 |
| 1091.0 | 0 |
| 1090.0 | 0 |
| 1089.0 | 0 |
| 1088.0 | 0 |
| 1087.0 | 0 |
| 1086.0 | 0 |
| 1085.0 | 0 |
| 1084.0 | 0 |
| 1083.0 | 0 |
| 1082.0 | 0 |
| 1081.0 | 0 |
| 1080.0 | 0 |
| 1079.0 | 0 |
| 1078.0 | 0 |
| 1077.0 | 0 |
| 1076.0 | 0 |
| 1075.0 | 0 |
| 1074.0 | 0 |
| 1073.0 | 0 |
| 1072.0 | 0 |
| 1071.0 | 0 |
| 1070.0 | 0 |
| 1069.0 | 0 |
| 1068.0 | 0 |
| 1067.0 | 0 |
| 1066.0 | 0 |
| 1065.0 | 0 |
| 1064.0 | 0 |
| 1063.0 | 0 |
| 1062.0 | 0 |
| 1061.0 | 0 |
| 1060.0 | 0 |
| 1059.0 | 0 |
| 1058.0 | 0 |
| 1057.0 | 0 |
| 1056.0 | 0 |
| 1055.0 | 0 |
| 1054.0 | 0 |
| 1053.0 | 0 |
| 1052.0 | 0 |
| 1051.0 | 0 |
| 1050.0 | 0 |
| 1049.0 | 0 |
| 1048.0 | 0 |
| 1047.0 | 0 |
| 1046.0 | 0 |
| 1045.0 | 0 |
| 1044.0 | 0 |
| 1043.0 | 0 |
| 1042.0 | 0 |
| 1041.0 | 0 |
| 1040.0 | 0 |
| 1039.0 | 0 |
| 1038.0 | 0 |
| 1037.0 | 0 |
| 1036.0 | 0 |
| 1035.0 | 0 |
| 1034.0 | 0 |
| 1033.0 | 0 |
| 1032.0 | 0 |
| 1031.0 | 0 |
| 1030.0 | 0 |
| 1029.0 | 0 |
| 1028.0 | 0 |
| 1027.0 | 0 |
| 1026.0 | 0 |
| 1025.0 | 0 |
| 1024.0 | 0 |
| 1023.0 | 0 |
| 1022.0 | 0 |
| 1021.0 | 0 |
| 1020.0 | 0 |
| 1019.0 | 0 |
| 1018.0 | 0 |
| 1017.0 | 0 |
| 1016.0 | 0 |
| 1015.0 | 0 |
| 1014.0 | 0 |
| 1013.0 | 0 |
| 1012.0 | 0 |
| 1011.0 | 0 |
| 1010.0 | 0 |
| 1009.0 | 0 |
| 1008.0 | 0 |
| 1007.0 | 0 |
| 1006.0 | 0 |
| 1005.0 | 0 |
| 1004.0 | 0 |
| 1003.0 | 0 |
| 1002.0 | 0 |
| 1001.0 | 0 |
| 1000.0 | 0 |
| 999.0 | 0 |
| 998.0 | 0 |
| 997.0 | 0 |
| 996.0 | 0 |
| 995.0 | 0 |
| 994.0 | 0 |
| 993.0 | 0 |
| 992.0 | 0 |
| 991.0 | 0 |
| 990.0 | 0 |
| 989.0 | 0 |
| 988.0 | 0 |
| 987.0 | 0 |
| 986.0 | 0 |
| 985.0 | 0 |
| 984.0 | 0 |
| 983.0 | 0 |
| 982.0 | 0 |
| 981.0 | 0 |
| 980.0 | 0 |
| 979.0 | 0 |
| 978.0 | 0 |
| 977.0 | 0 |
| 976.0 | 0 |
| 975.0 | 0 |
| 974.0 | 0 |
| 973.0 | 0 |
| 972.0 | 0 |
| 971.0 | 0 |
| 970.0 | 0 |
| 969.0 | 0 |
| 968.0 | 0 |
| 967.0 | 0 |
| 966.0 | 0 |
| 965.0 | 0 |
| 964.0 | 0 |
| 963.0 | 0 |
| 962.0 | 0 |
| 961.0 | 0 |
| 960.0 | 0 |
| 959.0 | 0 |
| 958.0 | 0 |
| 957.0 | 0 |
| 956.0 | 0 |
| 955.0 | 0 |
| 954.0 | 0 |
| 953.0 | 0 |
| 952.0 | 0 |
| 951.0 | 0 |
| 950.0 | 0 |
| 949.0 | 0 |
| 948.0 | 0 |
| 947.0 | 0 |
| 946.0 | 0 |
| 945.0 | 0 |
| 944.0 | 0 |
| 943.0 | 0 |
| 942.0 | 0 |
| 941.0 | 0 |
| 940.0 | 0 |
| 939.0 | 0 |
| 938.0 | 0 |
| 937.0 | 0 |
| 936.0 | 0 |
| 935.0 | 0 |
| 934.0 | 0 |
| 933.0 | 0 |
| 932.0 | 0 |
| 931.0 | 0 |
| 930.0 | 0 |
| 929.0 | 0 |
| 928.0 | 0 |
| 927.0 | 0 |
| 926.0 | 0 |
| 925.0 | 0 |
| 924.0 | 0 |
| 923.0 | 0 |
| 922.0 | 0 |
| 921.0 | 0 |
| 920.0 | 0 |
| 919.0 | 0 |
| 918.0 | 0 |
| 917.0 | 0 |
| 916.0 | 0 |
| 915.0 | 0 |
| 914.0 | 0 |
| 913.0 | 0 |
| 912.0 | 0 |
| 911.0 | 0 |
| 910.0 | 0 |
| 909.0 | 0 |
| 908.0 | 0 |
| 907.0 | 0 |
| 906.0 | 0 |
| 905.0 | 0 |
| 904.0 | 0 |
| 903.0 | 0 |
| 902.0 | 0 |
| 901.0 | 0 |
| 900.0 | 0 |
| 899.0 | 0 |
| 898.0 | 0 |
| 897.0 | 0 |
| 896.0 | 0 |
| 895.0 | 0 |
| 894.0 | 0 |
| 893.0 | 0 |
| 892.0 | 0 |
| 891.0 | 0 |
| 890.0 | 0 |
| 889.0 | 0 |
| 888.0 | 0 |
| 887.0 | 0 |
| 886.0 | 0 |
| 885.0 | 0 |
| 884.0 | 0 |
| 883.0 | 0 |
| 882.0 | 0 |
| 881.0 | 0 |
| 880.0 | 0 |
| 879.0 | 0 |
| 878.0 | 0 |
| 877.0 | 0 |
| 876.0 | 0 |
| 875.0 | 0 |
| 874.0 | 0 |
| 873.0 | 0 |
| 872.0 | 0 |
| 871.0 | 0 |
| 870.0 | 0 |
| 869.0 | 0 |
| 868.0 | 0 |
| 867.0 | 0 |
| 866.0 | 0.001 |
| 865.0 | 0.001 |
| 864.0 | 0 |
| 863.0 | 0.001 |
| 862.0 | 0 |
| 861.0 | 0 |
| 860.0 | 0.001 |
| 859.0 | 0 |
| 858.0 | 0.001 |
| 857.0 | 0.001 |
| 856.0 | 0.001 |
| 855.0 | 0.001 |
| 854.0 | 0.001 |
| 853.0 | 0.001 |
| 852.0 | 0.001 |
| 851.0 | 0.001 |
| 850.0 | 0.001 |
| 849.0 | 0.001 |
| 848.0 | 0.001 |
| 847.0 | 0.001 |
| 846.0 | 0.001 |
| 845.0 | 0.001 |
| 844.0 | 0.001 |
| 843.0 | 0.001 |
| 842.0 | 0.001 |
| 841.0 | 0.001 |
| 840.0 | 0.001 |
| 839.0 | 0.001 |
| 838.0 | 0.001 |
| 837.0 | 0.001 |
| 836.0 | 0.001 |
| 835.0 | 0.001 |
| 834.0 | 0.001 |
| 833.0 | 0.001 |
| 832.0 | 0.001 |
| 831.0 | 0.001 |
| 830.0 | 0.001 |
| 829.0 | 0.001 |
| 828.0 | 0.001 |
| 827.0 | 0.001 |
| 826.0 | 0.001 |
| 825.0 | 0.001 |
| 824.0 | 0.001 |
| 823.0 | 0.002 |
| 822.0 | 0.001 |
| 821.0 | 0.002 |
| 820.0 | 0.001 |
| 819.0 | 0.002 |
| 818.0 | 0.001 |
| 817.0 | 0.002 |
| 816.0 | 0.001 |
| 815.0 | 0.002 |
| 814.0 | 0.002 |
| 813.0 | 0.002 |
| 812.0 | 0.002 |
| 811.0 | 0.002 |
| 810.0 | 0.002 |
| 809.0 | 0.002 |
| 808.0 | 0.002 |
| 807.0 | 0.002 |
| 806.0 | 0.002 |
| 805.0 | 0.002 |
| 804.0 | 0.002 |
| 803.0 | 0.002 |
| 802.0 | 0.002 |
| 801.0 | 0.003 |
| 800.0 | 0.002 |
| 799.0 | 0 |
| 798.0 | 0 |
| 797.0 | 0 |
| 796.0 | 0 |
| 795.0 | 0 |
| 794.0 | 0 |
| 793.0 | 0 |
| 792.0 | 0 |
| 791.0 | 0 |
| 790.0 | 0 |
| 789.0 | 0 |
| 788.0 | 0 |
| 787.0 | 0 |
| 786.0 | 0 |
| 785.0 | 0 |
| 784.0 | 0 |
| 783.0 | 0 |
| 782.0 | 0 |
| 781.0 | 0 |
| 780.0 | 0 |
| 779.0 | 0 |
| 778.0 | 0 |
| 777.0 | 0 |
| 776.0 | 0 |
| 775.0 | 0 |
| 774.0 | 0 |
| 773.0 | 0 |
| 772.0 | 0 |
| 771.0 | 0 |
| 770.0 | 0 |
| 769.0 | 0 |
| 768.0 | 0 |
| 767.0 | 0 |
| 766.0 | 0 |
| 765.0 | 0 |
| 764.0 | 0 |
| 763.0 | 0 |
| 762.0 | 0 |
| 761.0 | 0 |
| 760.0 | 0 |
| 759.0 | 0 |
| 758.0 | 0 |
| 757.0 | 0 |
| 756.0 | 0 |
| 755.0 | 0 |
| 754.0 | 0 |
| 753.0 | 0 |
| 752.0 | 0 |
| 751.0 | 0 |
| 750.0 | 0 |
| 749.0 | 0 |
| 748.0 | 0 |
| 747.0 | 0 |
| 746.0 | 0 |
| 745.0 | 0 |
| 744.0 | 0 |
| 743.0 | 0 |
| 742.0 | 0 |
| 741.0 | 0 |
| 740.0 | 0 |
| 739.0 | 0 |
| 738.0 | 0 |
| 737.0 | 0 |
| 736.0 | 0 |
| 735.0 | 0 |
| 734.0 | 0 |
| 733.0 | 0 |
| 732.0 | 0 |
| 731.0 | 0 |
| 730.0 | 0 |
| 729.0 | 0 |
| 728.0 | 0 |
| 727.0 | 0 |
| 726.0 | 0 |
| 725.0 | 0 |
| 724.0 | 0 |
| 723.0 | 0 |
| 722.0 | 0 |
| 721.0 | 0 |
| 720.0 | 0 |
| 719.0 | 0 |
| 718.0 | 0 |
| 717.0 | 0 |
| 716.0 | 0 |
| 715.0 | 0 |
| 714.0 | 0 |
| 713.0 | 0 |
| 712.0 | 0 |
| 711.0 | 0 |
| 710.0 | 0 |
| 709.0 | 0 |
| 708.0 | 0 |
| 707.0 | 0 |
| 706.0 | 0 |
| 705.0 | 0 |
| 704.0 | 0 |
| 703.0 | 0 |
| 702.0 | 0 |
| 701.0 | 0 |
| 700.0 | 0 |
| 699.0 | 0 |
| 698.0 | 0 |
| 697.0 | 0 |
| 696.0 | 0 |
| 695.0 | 0 |
| 694.0 | 0 |
| 693.0 | 0 |
| 692.0 | 0 |
| 691.0 | 0 |
| 690.0 | 0 |
| 689.0 | 0 |
| 688.0 | 0 |
| 687.0 | 0 |
| 686.0 | 0 |
| 685.0 | 0 |
| 684.0 | 0 |
| 683.0 | 0 |
| 682.0 | 0 |
| 681.0 | 0 |
| 680.0 | 0 |
| 679.0 | 0 |
| 678.0 | 0 |
| 677.0 | 0 |
| 676.0 | 0 |
| 675.0 | 0 |
| 674.0 | 0 |
| 673.0 | 0 |
| 672.0 | 0 |
| 671.0 | 0 |
| 670.0 | 0 |
| 669.0 | 0 |
| 668.0 | 0 |
| 667.0 | 0 |
| 666.0 | 0 |
| 665.0 | 0 |
| 664.0 | 0 |
| 663.0 | 0 |
| 662.0 | 0 |
| 661.0 | 0 |
| 660.0 | 0 |
| 659.0 | 0 |
| 658.0 | 0 |
| 657.0 | 0 |
| 656.0 | 0 |
| 655.0 | 0 |
| 654.0 | 0 |
| 653.0 | 0 |
| 652.0 | 0 |
| 651.0 | 0 |
| 650.0 | 0 |
| 649.0 | 0 |
| 648.0 | 0 |
| 647.0 | 0 |
| 646.0 | 0 |
| 645.0 | 0 |
| 644.0 | 0 |
| 643.0 | 0 |
| 642.0 | 0 |
| 641.0 | 0 |
| 640.0 | 0 |
| 639.0 | 0 |
| 638.0 | 0 |
| 637.0 | 0 |
| 636.0 | 0 |
| 635.0 | 0 |
| 634.0 | 0 |
| 633.0 | 0 |
| 632.0 | 0 |
| 631.0 | 0 |
| 630.0 | 0 |
| 629.0 | 0 |
| 628.0 | 0 |
| 627.0 | 0 |
| 626.0 | 0 |
| 625.0 | 0 |
| 624.0 | 0 |
| 623.0 | 0 |
| 622.0 | 0 |
| 621.0 | 0 |
| 620.0 | 0 |
| 619.0 | 0 |
| 618.0 | 0 |
| 617.0 | 0 |
| 616.0 | 0 |
| 615.0 | 0 |
| 614.0 | 0 |
| 613.0 | 0 |
| 612.0 | 0 |
| 611.0 | 0 |
| 610.0 | 0 |
| 609.0 | 0 |
| 608.0 | 0 |
| 607.0 | 0 |
| 606.0 | 0 |
| 605.0 | 0 |
| 604.0 | 0 |
| 603.0 | 0 |
| 602.0 | 0 |
| 601.0 | 0 |
| 600.0 | 0 |
| 599.0 | 0 |
| 598.0 | 0 |
| 597.0 | 0 |
| 596.0 | 0 |
| 595.0 | 0 |
| 594.0 | 0 |
| 593.0 | 0 |
| 592.0 | 0 |
| 591.0 | 0 |
| 590.0 | 0 |
| 589.0 | 0 |
| 588.0 | 0 |
| 587.0 | 0 |
| 586.0 | 0 |
| 585.0 | 0 |
| 584.0 | 0 |
| 583.0 | 0 |
| 582.0 | 0 |
| 581.0 | 0 |
| 580.0 | 0 |
| 579.0 | 0 |
| 578.0 | 0 |
| 577.0 | 0 |
| 576.0 | 0 |
| 575.0 | 0 |
| 574.0 | 0 |
| 573.0 | 0 |
| 572.0 | 0 |
| 571.0 | 0 |
| 570.0 | 0 |
| 569.0 | 0 |
| 568.0 | 0 |
| 567.0 | 0 |
| 566.0 | 0 |
| 565.0 | 0 |
| 564.0 | 0 |
| 563.0 | 0 |
| 562.0 | 0 |
| 561.0 | 0 |
| 560.0 | 0 |
| 559.0 | 0 |
| 558.0 | 0 |
| 557.0 | 0 |
| 556.0 | 0 |
| 555.0 | 0 |
| 554.0 | 0 |
| 553.0 | 0 |
| 552.0 | 0 |
| 551.0 | 0 |
| 550.0 | 0 |
| 549.0 | 0 |
| 548.0 | 0 |
| 547.0 | 0 |
| 546.0 | 0 |
| 545.0 | 0 |
| 544.0 | 0 |
| 543.0 | 0 |
| 542.0 | 0 |
| 541.0 | 0 |
| 540.0 | 0 |
| 539.0 | 0 |
| 538.0 | 0 |
| 537.0 | 0 |
| 536.0 | 0 |
| 535.0 | 0 |
| 534.0 | 0 |
| 533.0 | 0 |
| 532.0 | 0 |
| 531.0 | 0 |
| 530.0 | 0 |
| 529.0 | 0 |
| 528.0 | 0 |
| 527.0 | 0 |
| 526.0 | 0 |
| 525.0 | 0 |
| 524.0 | 0 |
| 523.0 | 0 |
| 522.0 | 0 |
| 521.0 | 0 |
| 520.0 | 0 |
| 519.0 | 0 |
| 518.0 | 0 |
| 517.0 | 0 |
| 516.0 | 0 |
| 515.0 | 0 |
| 514.0 | 0 |
| 513.0 | 0 |
| 512.0 | 0 |
| 511.0 | 0 |
| 510.0 | 0 |
| 509.0 | 0 |
| 508.0 | 0 |
| 507.0 | 0 |
| 506.0 | 0 |
| 505.0 | 0 |
| 504.0 | 0 |
| 503.0 | 0 |
| 502.0 | 0 |
| 501.0 | 0 |
| 500.0 | 0 |
| 499.0 | 0 |
| 498.0 | 0 |
| 497.0 | 0 |
| 496.0 | 0 |
| 495.0 | 0 |
| 494.0 | 0.001 |
| 493.0 | 0.001 |
| 492.0 | 0.001 |
| 491.0 | 0.001 |
| 490.0 | 0.001 |
| 489.0 | 0.001 |
| 488.0 | 0.001 |
| 487.0 | 0.001 |
| 486.0 | 0.001 |
| 485.0 | 0.001 |
| 484.0 | 0.002 |
| 483.0 | 0.002 |
| 482.0 | 0.002 |
| 481.0 | 0.002 |
| 480.0 | 0.003 |
| 479.0 | 0.003 |
| 478.0 | 0.004 |
| 477.0 | 0.004 |
| 476.0 | 0.005 |
| 475.0 | 0.006 |
| 474.0 | 0.007 |
| 473.0 | 0.009 |
| 472.0 | 0.011 |
| 471.0 | 0.013 |
| 470.0 | 0.016 |
| 469.0 | 0.021 |
| 468.0 | 0.027 |
| 467.0 | 0.035 |
| 466.0 | 0.047 |
| 465.0 | 0.065 |
| 464.0 | 0.092 |
| 463.0 | 0.133 |
| 462.0 | 0.2 |
| 461.0 | 0.315 |
| 460.0 | 0.52 |
| 459.0 | 0.907 |
| 458.0 | 1.686 |
| 457.0 | 3.342 |
| 456.0 | 6.768 |
| 455.0 | 13.332 |
| 454.0 | 23.373 |
| 453.0 | 34.533 |
| 452.0 | 43.209 |
| 451.0 | 47.837 |
| 450.0 | 49.575 |
| 449.0 | 49.989 |
| 448.0 | 50.122 |
| 447.0 | 50.032 |
| 446.0 | 49.017 |
| 445.0 | 43.047 |
| 444.0 | 31.108 |
| 443.0 | 17.969 |
| 442.0 | 8.485 |
| 441.0 | 3.668 |
| 440.0 | 1.655 |
| 439.0 | 0.808 |
| 438.0 | 0.426 |
| 437.0 | 0.24 |
| 436.0 | 0.143 |
| 435.0 | 0.089 |
| 434.0 | 0.058 |
| 433.0 | 0.039 |
| 432.0 | 0.027 |
| 431.0 | 0.019 |
| 430.0 | 0.014 |
| 429.0 | 0.011 |
| 428.0 | 0.008 |
| 427.0 | 0.006 |
| 426.0 | 0.005 |
| 425.0 | 0.004 |
| 424.0 | 0.003 |
| 423.0 | 0.003 |
| 422.0 | 0.002 |
| 421.0 | 0.002 |
| 420.0 | 0.002 |
| 419.0 | 0.001 |
| 418.0 | 0.001 |
| 417.0 | 0.001 |
| 416.0 | 0.001 |
| 415.0 | 0 |
| 414.0 | 0 |
| 413.0 | 0 |
| 412.0 | 0 |
| 411.0 | 0 |
| 410.0 | 0 |
| 409.0 | 0 |
| 408.0 | 0 |
| 407.0 | 0 |
| 406.0 | 0 |
| 405.0 | 0 |
| 404.0 | 0 |
| 403.0 | 0 |
| 402.0 | 0 |
| 401.0 | 0 |
| 400.0 | 0 |
| 399.0 | 0 |
| 398.0 | 0 |
| 397.0 | 0 |
| 396.0 | 0 |
| 395.0 | 0 |
| 394.0 | 0 |
| 393.0 | 0 |
| 392.0 | 0 |
| 391.0 | 0 |
| 390.0 | 0 |
| 389.0 | 0 |
| 388.0 | 0 |
| 387.0 | 0 |
| 386.0 | 0 |
| 385.0 | 0 |
| 384.0 | 0 |
| 383.0 | 0 |
| 382.0 | 0 |
| 381.0 | 0 |
| 380.0 | 0 |
| 379.0 | 0 |
| 378.0 | 0 |
| 377.0 | 0 |
| 376.0 | 0 |
| 375.0 | 0 |
| 374.0 | 0 |
| 373.0 | 0 |
| 372.0 | 0 |
| 371.0 | 0 |
| 370.0 | 0 |
| 369.0 | 0 |
| 368.0 | 0 |
| 367.0 | 0 |
| 366.0 | 0 |
| 365.0 | 0 |
| 364.0 | 0 |
| 363.0 | 0 |
| 362.0 | 0 |
| 361.0 | 0 |
| 360.0 | 0 |
| 359.0 | 0 |
| 358.0 | 0 |
| 357.0 | 0 |
| 356.0 | 0 |
| 355.0 | 0 |
| 354.0 | 0 |
| 353.0 | 0 |
| 352.0 | 0 |
| 351.0 | 0 |
| 350.0 | 0 |
| 349.0 | 0 |
| 348.0 | 0 |
| 347.0 | 0 |
| 346.0 | 0 |
| 345.0 | 0 |
| 344.0 | 0 |
| 343.0 | 0 |
| 342.0 | 0 |
| 341.0 | 0 |
| 340.0 | 0 |
| 339.0 | 0 |
| 338.0 | 0 |
| 337.0 | 0 |
| 336.0 | 0 |
| 335.0 | 0 |
| 334.0 | 0 |
| 333.0 | 0 |
| 332.0 | 0 |
| 331.0 | 0 |
| 330.0 | 0 |
| 329.0 | 0 |
| 328.0 | 0 |
| 327.0 | 0 |
| 326.0 | 0 |
| 325.0 | 0 |
| 324.0 | 0 |
| 323.0 | 0 |
| 322.0 | 0 |
| 321.0 | 0 |
| 320.0 | 0 |
| 319.0 | 0 |
| 318.0 | 0 |
| 317.0 | 0 |
| 316.0 | 0 |
| 315.0 | 0 |
| 314.0 | 0 |
| 313.0 | 0 |
| 312.0 | 0 |
| 311.0 | 0 |
| 310.0 | 0 |
| 309.0 | 0 |
| 308.0 | 0 |
| 307.0 | 0 |
| 306.0 | 0 |
| 305.0 | 0 |
| 304.0 | 0 |
| 303.0 | 0 |
| 302.0 | 0 |
| 301.0 | 0 |
| 300.0 | 0 |
| 299.0 | 0 |
| 298.0 | 0 |
| 297.0 | 0 |
| 296.0 | 0 |
| 295.0 | 0 |
| 294.0 | 0 |
| 293.0 | 0 |
| 292.0 | 0 |
| 291.0 | 0 |
| 290.0 | 0 |
| 289.0 | 0 |
| 288.0 | 0 |
| 287.0 | 0 |
| 286.0 | 0 |
| 285.0 | 0 |
| 284.0 | 0 |
| 283.0 | 0 |
| 282.0 | 0 |
| 281.0 | 0 |
| 280.0 | 0 |
| 279.0 | 0 |
| 278.0 | 0 |
| 277.0 | 0 |
| 276.0 | 0 |
| 275.0 | 0 |
| 274.0 | 0 |
| 273.0 | 0 |
| 272.0 | 0 |
| 271.0 | 0 |
| 270.0 | 0 |
| 269.0 | 0 |
| 268.0 | 0 |
| 267.0 | 0 |
| 266.0 | 0 |
| 265.0 | 0 |
| 264.0 | 0 |
| 263.0 | 0 |
| 262.0 | 0 |
| 261.0 | 0 |
| 260.0 | 0 |
| 259.0 | 0 |
| 258.0 | 0 |
| 257.0 | 0 |
| 256.0 | 0 |
| 255.0 | 0 |
| 254.0 | 0 |
| 253.0 | 0 |
| 252.0 | 0 |
| 251.0 | 0 |
| 250.0 | 0 |
| 249.0 | 0 |
| 248.0 | 0 |
| 247.0 | 0 |
| 246.0 | 0 |
| 245.0 | 0 |
| 244.0 | 0 |
| 243.0 | 0 |
| 242.0 | 0 |
| 241.0 | 0 |
| 240.0 | 0 |
| 239.0 | 0 |
| 238.0 | 0 |
| 237.0 | 0 |
| 236.0 | 0 |
| 235.0 | 0 |
| 234.0 | 0 |
| 233.0 | 0 |
| 232.0 | 0 |
| 231.0 | 0 |
| 230.0 | 0 |
| 229.0 | 0 |
| 228.0 | 0 |
| 227.0 | 0 |
| 226.0 | 0 |
| 225.0 | 0 |
| 224.0 | 0 |
| 223.0 | 0 |
| 222.0 | 0 |
| 221.0 | 0 |
| 220.0 | 0 |
| 219.0 | 0 |
| 218.0 | 0 |
| 217.0 | 0 |
| 216.0 | 0 |
| 215.0 | 0 |
| 214.0 | 0 |
| 213.0 | 0 |
| 212.0 | 0 |
| 211.0 | 0 |
| 210.0 | 0 |
| 209.0 | 0 |
| 208.0 | 0 |
| 207.0 | 0 |
| 206.0 | 0 |
| 205.0 | 0 |
| 204.0 | 0 |
| 203.0 | 0 |
| 202.0 | 0 |
| 201.0 | 0 |